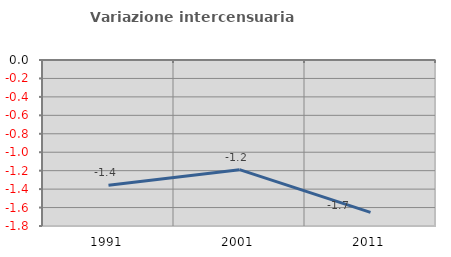
| Category | Variazione intercensuaria annua |
|---|---|
| 1991.0 | -1.358 |
| 2001.0 | -1.189 |
| 2011.0 | -1.652 |